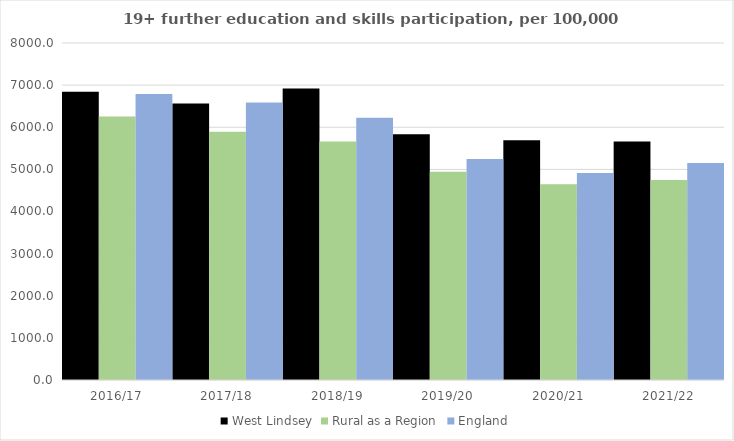
| Category | West Lindsey | Rural as a Region | England |
|---|---|---|---|
| 2016/17 | 6844 | 6253.401 | 6788 |
| 2017/18 | 6564 | 5892.029 | 6588 |
| 2018/19 | 6921 | 5661.873 | 6227 |
| 2019/20 | 5836 | 4943.801 | 5244 |
| 2020/21 | 5694 | 4646.727 | 4913 |
| 2021/22 | 5664 | 4747.049 | 5151 |